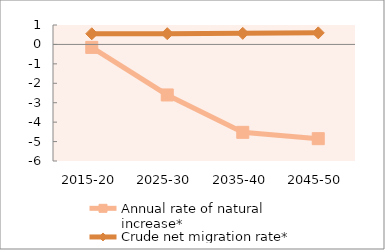
| Category | Annual rate of natural increase* | Crude net migration rate* |
|---|---|---|
| 2015-20 | -0.153 | 0.549 |
| 2025-30 | -2.601 | 0.553 |
| 2035-40 | -4.525 | 0.571 |
| 2045-50 | -4.851 | 0.595 |